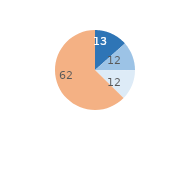
| Category | Series 0 |
|---|---|
| Importants | 13.38 |
| Assez importants | 11.551 |
| Peu importants | 12.203 |
| Pas de dégradations | 62.296 |